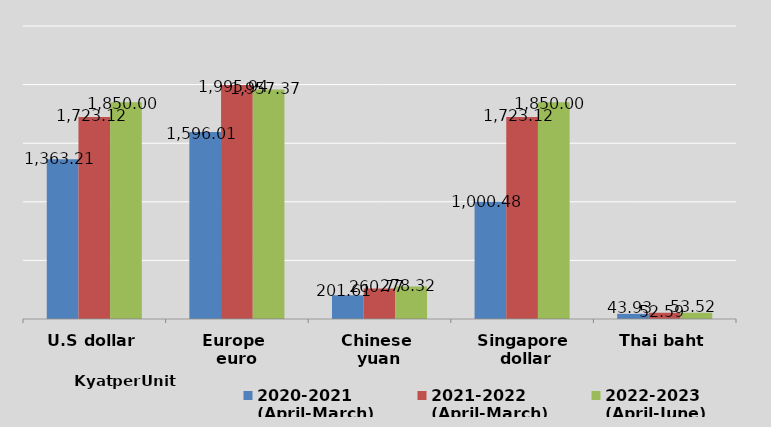
| Category | 2020-2021
(April-March) | 2021-2022
(April-March) | 2022-2023
(April-June) |
|---|---|---|---|
| U.S dollar | 1363.208 | 1723.117 | 1850 |
| Europe 
euro | 1596.008 | 1995.942 | 1957.367 |
| Chinese 
yuan | 201.608 | 260.774 | 278.317 |
| Singapore
 dollar | 1000.475 | 1723.117 | 1850 |
| Thai baht | 43.929 | 52.595 | 53.522 |